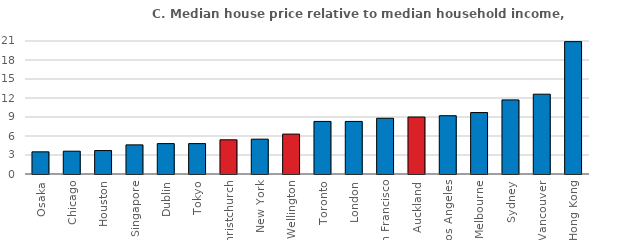
| Category | Series 0 |
|---|---|
| Osaka | 3.5 |
| Chicago | 3.6 |
| Houston | 3.7 |
| Singapore | 4.6 |
| Dublin | 4.8 |
| Tokyo | 4.8 |
| Christchurch | 5.4 |
| New York | 5.5 |
| Wellington | 6.3 |
| Toronto | 8.3 |
| London | 8.3 |
| San Francisco | 8.8 |
| Auckland | 9 |
| Los Angeles | 9.2 |
| Melbourne | 9.7 |
| Sydney | 11.7 |
| Vancouver | 12.6 |
| Hong Kong | 20.9 |